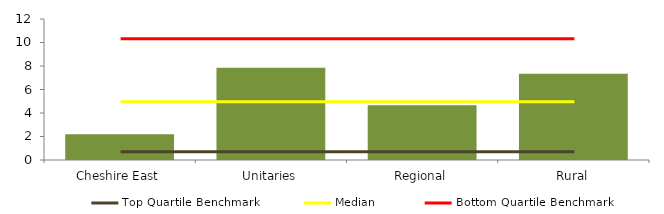
| Category | Block Data |
|---|---|
| Cheshire East | 2.2 |
| Unitaries | 7.841 |
| Regional | 4.65 |
|  Rural  | 7.35 |